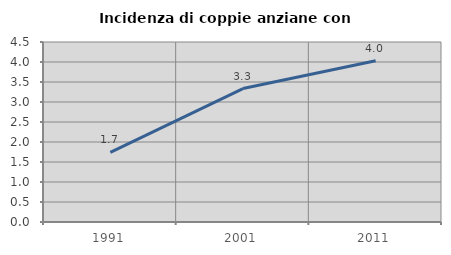
| Category | Incidenza di coppie anziane con figli |
|---|---|
| 1991.0 | 1.739 |
| 2001.0 | 3.336 |
| 2011.0 | 4.031 |